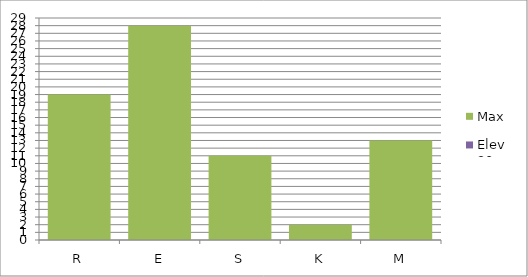
| Category | Max | Elev 30 |
|---|---|---|
| R | 19 | 0 |
| E | 28 | 0 |
| S | 11 | 0 |
| K | 2 | 0 |
| M | 13 | 0 |